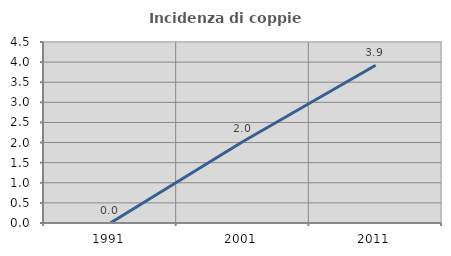
| Category | Incidenza di coppie miste |
|---|---|
| 1991.0 | 0 |
| 2001.0 | 2.027 |
| 2011.0 | 3.922 |